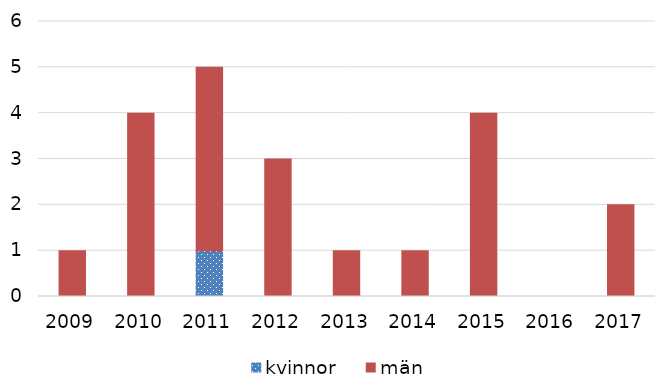
| Category | kvinnor | män |
|---|---|---|
| 2009 | 0 | 1 |
| 2010 | 0 | 4 |
| 2011 | 1 | 4 |
| 2012 | 0 | 3 |
| 2013 | 0 | 1 |
| 2014 | 0 | 1 |
| 2015 | 0 | 4 |
| 2016 | 0 | 0 |
| 2017 | 0 | 2 |